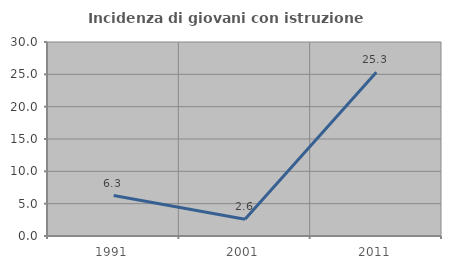
| Category | Incidenza di giovani con istruzione universitaria |
|---|---|
| 1991.0 | 6.25 |
| 2001.0 | 2.597 |
| 2011.0 | 25.333 |